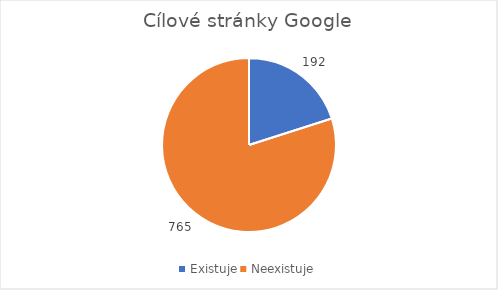
| Category | Series 0 |
|---|---|
| Existuje | 192 |
| Neexistuje | 765 |